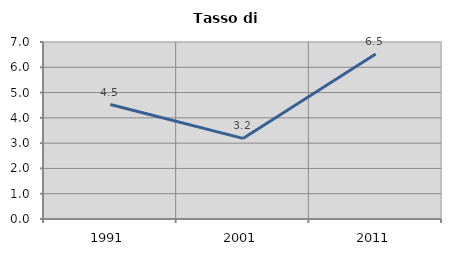
| Category | Tasso di disoccupazione   |
|---|---|
| 1991.0 | 4.527 |
| 2001.0 | 3.187 |
| 2011.0 | 6.53 |